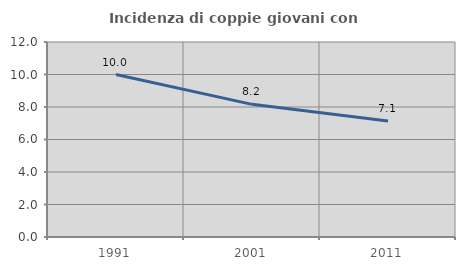
| Category | Incidenza di coppie giovani con figli |
|---|---|
| 1991.0 | 10 |
| 2001.0 | 8.163 |
| 2011.0 | 7.143 |